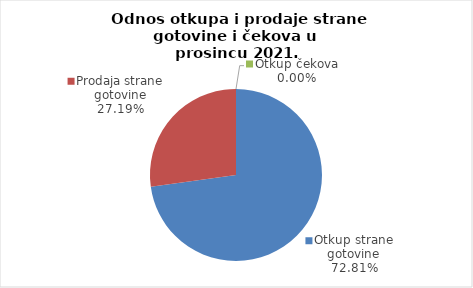
| Category | Series 0 |
|---|---|
| Otkup strane gotovine | 72.813 |
| Prodaja strane gotovine | 27.187 |
| Otkup čekova | 0 |